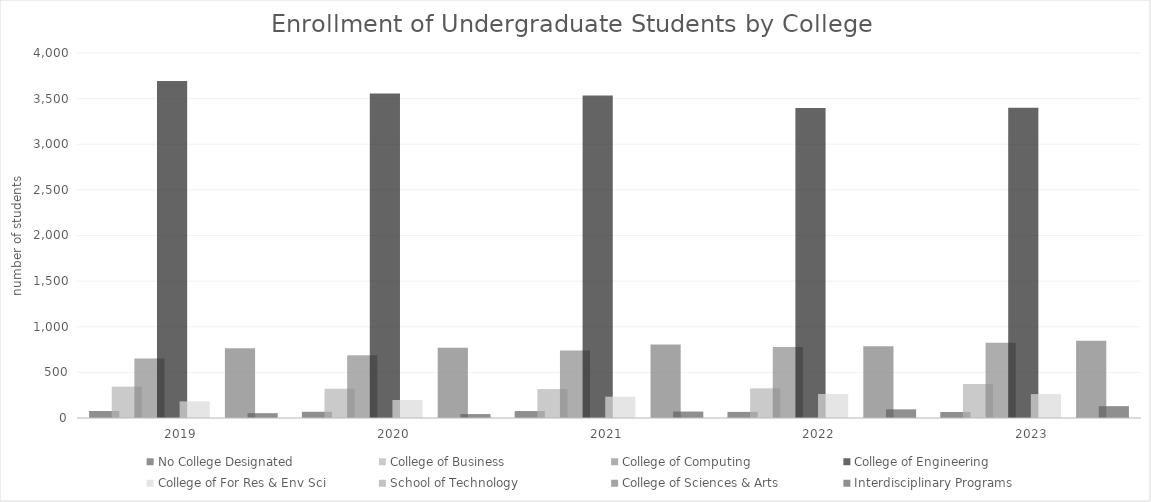
| Category | No College Designated | College of Business | College of Computing | College of Engineering | College of For Res & Env Sci | School of Technology | College of Sciences & Arts | Interdisciplinary Programs |
|---|---|---|---|---|---|---|---|---|
| 2019  | 77 | 344 | 651 | 3692 | 183 | 0 | 764 | 53 |
| 2020  | 68 | 321 | 689 | 3555 | 197 | 0 | 769 | 43 |
| 2021  | 76 | 317 | 741 | 3533 | 234 | 0 | 806 | 71 |
| 2022  | 67 | 325 | 777 | 3398 | 263 | 0 | 785 | 95 |
| 2023  | 66 | 373 | 824 | 3401 | 262 | 0 | 847 | 130 |